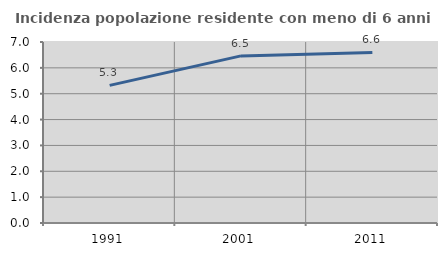
| Category | Incidenza popolazione residente con meno di 6 anni |
|---|---|
| 1991.0 | 5.322 |
| 2001.0 | 6.462 |
| 2011.0 | 6.597 |